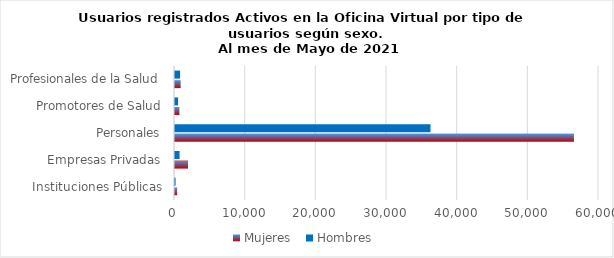
| Category | Mujeres | Hombres |
|---|---|---|
| Instituciones Públicas | 303 | 82 |
| Empresas Privadas | 1840 | 645 |
| Personales | 56460 | 36155 |
| Promotores de Salud | 622 | 437 |
| Profesionales de la Salud | 797 | 722 |